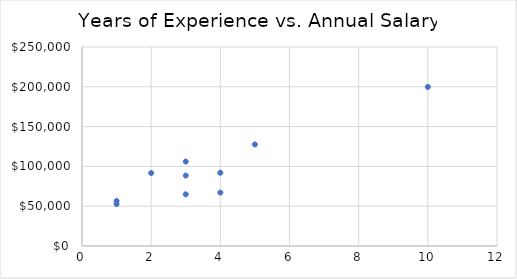
| Category | Years of Experience vs. Annual Salary |
|---|---|
| 1.0 | 52621 |
| 3.0 | 106079 |
| 4.0 | 92058 |
| 4.0 | 67114 |
| 1.0 | 56565 |
| 3.0 | 64937 |
| 5.0 | 127626 |
| 3.0 | 88478 |
| 2.0 | 91679 |
| 10.0 | 199848 |